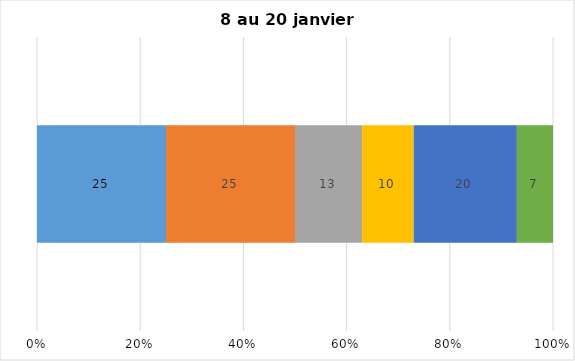
| Category | Plusieurs fois par jour | Une fois par jour | Quelques fois par semaine   | Une fois par semaine ou moins   |  Jamais   |  Je n’utilise pas les médias sociaux |
|---|---|---|---|---|---|---|
| 0 | 25 | 25 | 13 | 10 | 20 | 7 |